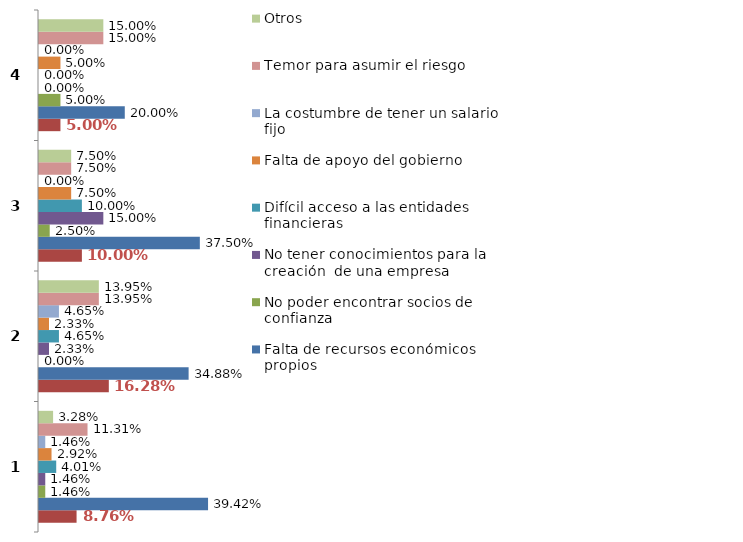
| Category | No estar seguro si la idea pueda  convertirse en un negocio exitoso | Falta de recursos económicos propios  | No poder encontrar socios de confianza  | No tener conocimientos para la creación  de una empresa  | Difícil acceso a las entidades financieras  | Falta de apoyo del gobierno | La costumbre de tener un salario fijo  | Temor para asumir el riesgo | Otros |
|---|---|---|---|---|---|---|---|---|---|
| 0 | 0.088 | 0.394 | 0.015 | 0.015 | 0.04 | 0.029 | 0.015 | 0.113 | 0.033 |
| 1 | 0.163 | 0.349 | 0 | 0.023 | 0.047 | 0.023 | 0.047 | 0.14 | 0.14 |
| 2 | 0.1 | 0.375 | 0.025 | 0.15 | 0.1 | 0.075 | 0 | 0.075 | 0.075 |
| 3 | 0.05 | 0.2 | 0.05 | 0 | 0 | 0.05 | 0 | 0.15 | 0.15 |